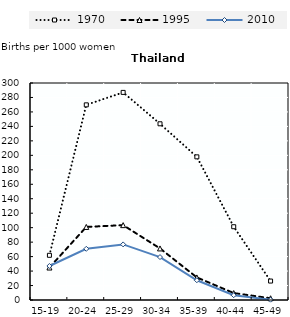
| Category | 1970 | 1995 | 2010 |
|---|---|---|---|
| 15-19 | 61.8 | 44.9 | 47.032 |
| 20-24 | 269.8 | 101 | 70.779 |
| 25-29 | 287 | 103.5 | 76.849 |
| 30-34 | 243.6 | 71.3 | 59.337 |
| 35-39 | 197.9 | 31.2 | 27.319 |
| 40-44 | 101.3 | 9.6 | 6.614 |
| 45-49 | 26.2 | 2.4 | 0.455 |